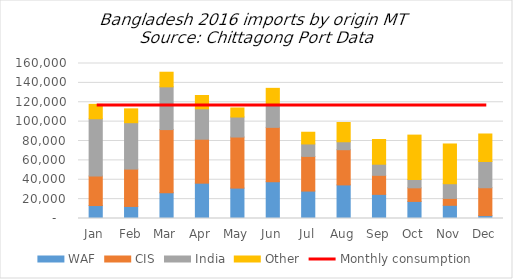
| Category | WAF | CIS | India | Other |
|---|---|---|---|---|
| Jan | 13373 | 30488 | 59106 | 14858 |
| Feb | 12450 | 38563 | 47886 | 14276 |
| Mar | 26607 | 65178 | 44135 | 15074 |
| Apr | 36476 | 45372 | 31384 | 13761 |
| May | 31388 | 52707 | 20667 | 9330 |
| Jun | 37949 | 56138 | 22867 | 17401 |
| Jul | 28308 | 35800 | 12837 | 12098 |
| Aug | 34664 | 36363 | 8192 | 19854 |
| Sep | 24906 | 19666 | 11459 | 25507 |
| Oct | 17634 | 14018 | 8619 | 45809 |
| Nov | 13621 | 7129 | 15141 | 41033 |
| Dec | 3010 | 28727 | 27107 | 28393 |